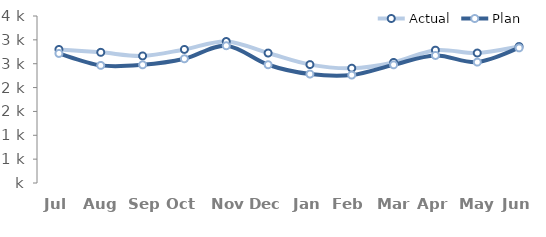
| Category | Actual | Plan |
|---|---|---|
| Jul | 2799.342 | 2715.362 |
| Aug | 2738.816 | 2464.934 |
| Sep | 2663.158 | 2476.737 |
| Oct | 2799.342 | 2603.388 |
| Nov | 2965.789 | 2876.816 |
| Dec | 2723.684 | 2478.553 |
| Jan | 2481.579 | 2283.053 |
| Feb | 2405.921 | 2261.566 |
| Mar | 2526.974 | 2476.434 |
| Apr | 2784.211 | 2672.842 |
| May | 2723.684 | 2533.026 |
| Jun | 2859.868 | 2831.27 |